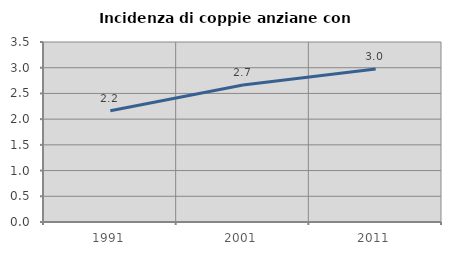
| Category | Incidenza di coppie anziane con figli |
|---|---|
| 1991.0 | 2.164 |
| 2001.0 | 2.664 |
| 2011.0 | 2.974 |